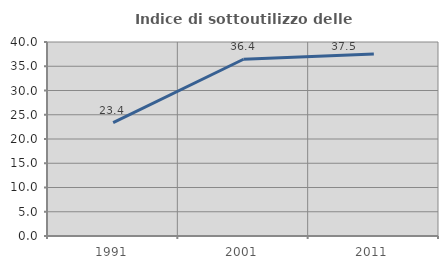
| Category | Indice di sottoutilizzo delle abitazioni  |
|---|---|
| 1991.0 | 23.379 |
| 2001.0 | 36.442 |
| 2011.0 | 37.548 |